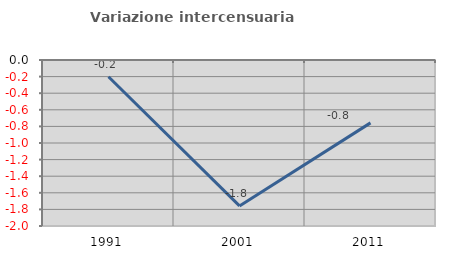
| Category | Variazione intercensuaria annua |
|---|---|
| 1991.0 | -0.202 |
| 2001.0 | -1.758 |
| 2011.0 | -0.758 |